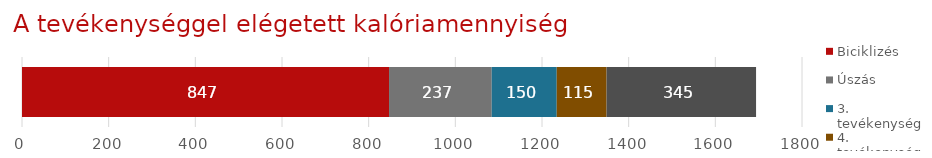
| Category | Biciklizés | Úszás | 3. tevékenység | 4. tevékenység | 5. tevékenység |
|---|---|---|---|---|---|
| Tevékenységnapló | 847 | 237 | 150 | 115 | 345 |